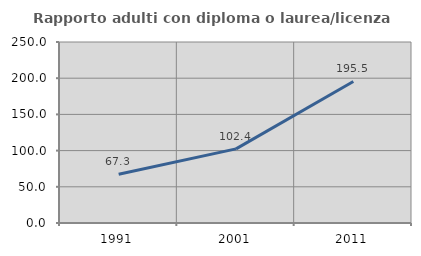
| Category | Rapporto adulti con diploma o laurea/licenza media  |
|---|---|
| 1991.0 | 67.317 |
| 2001.0 | 102.419 |
| 2011.0 | 195.477 |